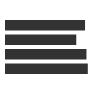
| Category | Series 0 |
|---|---|
| 0 | 459.552 |
| 1 | 408.6 |
| 2 | 467.845 |
| 3 | 475.604 |